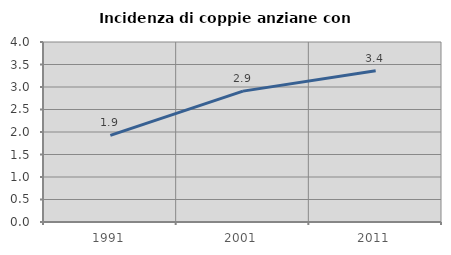
| Category | Incidenza di coppie anziane con figli |
|---|---|
| 1991.0 | 1.925 |
| 2001.0 | 2.909 |
| 2011.0 | 3.363 |